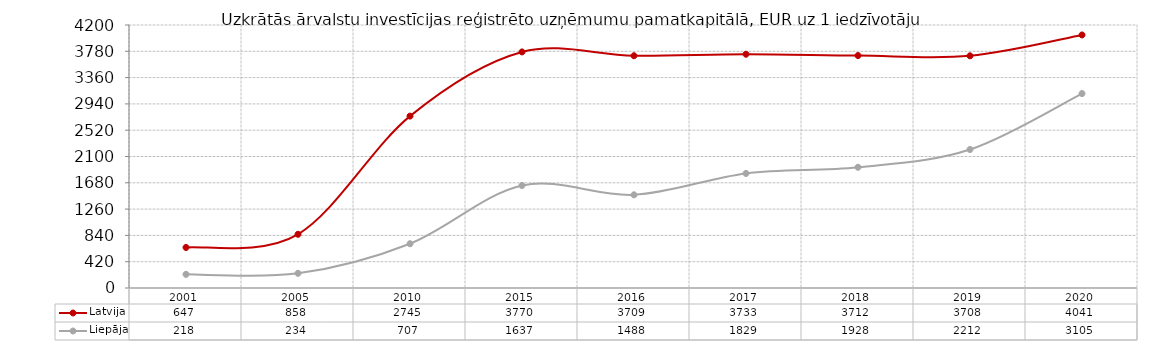
| Category | Latvija | Liepāja |
|---|---|---|
| 2001 | 647.36 | 217.699 |
| 2005 | 858 | 234 |
| 2010 | 2745 | 707 |
| 2015 | 3770 | 1637 |
| 2016 | 3709 | 1488 |
| 2017 | 3733 | 1829 |
| 2018 | 3712 | 1928 |
| 2019 | 3708 | 2212 |
| 2020 | 4041 | 3105 |